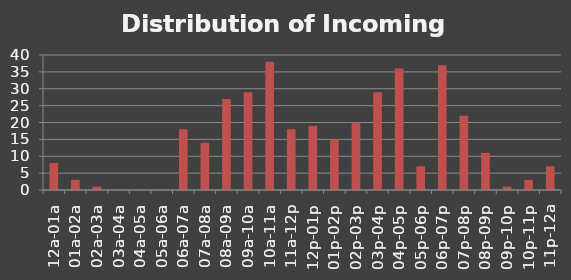
| Category | Frequency |
|---|---|
| 12a-01a | 8 |
| 01a-02a | 3 |
| 02a-03a | 1 |
| 03a-04a | 0 |
| 04a-05a | 0 |
| 05a-06a | 0 |
| 06a-07a | 18 |
| 07a-08a | 14 |
| 08a-09a | 27 |
| 09a-10a | 29 |
| 10a-11a | 38 |
| 11a-12p | 18 |
| 12p-01p | 19 |
| 01p-02p | 15 |
| 02p-03p | 20 |
| 03p-04p | 29 |
| 04p-05p | 36 |
| 05p-06p | 7 |
| 06p-07p | 37 |
| 07p-08p | 22 |
| 08p-09p | 11 |
| 09p-10p | 1 |
| 10p-11p | 3 |
| 11p-12a | 7 |